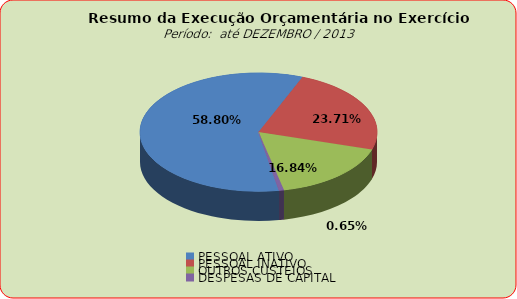
| Category | Series 0 |
|---|---|
| PESSOAL ATIVO | 98576119.99 |
| PESSOAL INATIVO | 39739489.91 |
| OUTROS CUSTEIOS | 28222995.73 |
| DESPESAS DE CAPITAL | 1097157.81 |